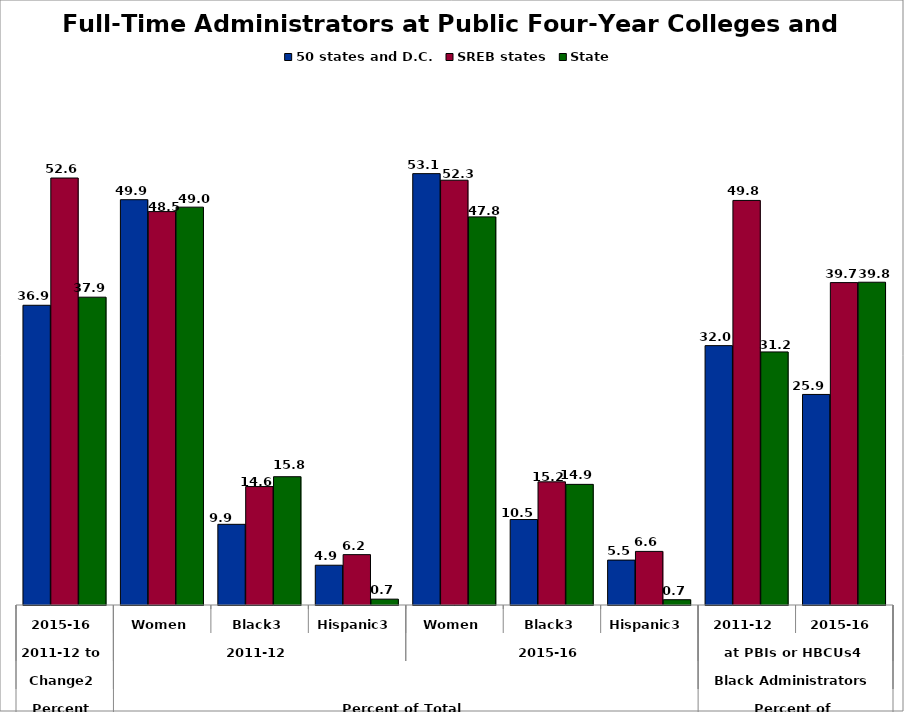
| Category | 50 states and D.C. | SREB states | State |
|---|---|---|---|
| 0 | 36.927 | 52.604 | 37.925 |
| 1 | 49.935 | 48.47 | 49.016 |
| 2 | 9.939 | 14.59 | 15.805 |
| 3 | 4.899 | 6.205 | 0.721 |
| 4 | 53.146 | 52.335 | 47.817 |
| 5 | 10.531 | 15.174 | 14.863 |
| 6 | 5.533 | 6.605 | 0.652 |
| 7 | 31.956 | 49.845 | 31.179 |
| 8 | 25.94 | 39.72 | 39.766 |